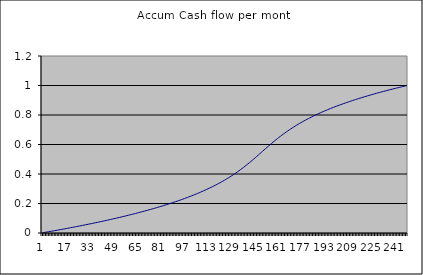
| Category | Accum Cash flow per month |
|---|---|
| 0 | 0.002 |
| 1 | 0.003 |
| 2 | 0.005 |
| 3 | 0.007 |
| 4 | 0.009 |
| 5 | 0.01 |
| 6 | 0.012 |
| 7 | 0.014 |
| 8 | 0.016 |
| 9 | 0.018 |
| 10 | 0.019 |
| 11 | 0.021 |
| 12 | 0.023 |
| 13 | 0.025 |
| 14 | 0.027 |
| 15 | 0.029 |
| 16 | 0.03 |
| 17 | 0.032 |
| 18 | 0.034 |
| 19 | 0.036 |
| 20 | 0.038 |
| 21 | 0.04 |
| 22 | 0.042 |
| 23 | 0.044 |
| 24 | 0.046 |
| 25 | 0.048 |
| 26 | 0.05 |
| 27 | 0.052 |
| 28 | 0.054 |
| 29 | 0.056 |
| 30 | 0.058 |
| 31 | 0.06 |
| 32 | 0.062 |
| 33 | 0.064 |
| 34 | 0.066 |
| 35 | 0.068 |
| 36 | 0.07 |
| 37 | 0.072 |
| 38 | 0.074 |
| 39 | 0.076 |
| 40 | 0.079 |
| 41 | 0.081 |
| 42 | 0.083 |
| 43 | 0.085 |
| 44 | 0.087 |
| 45 | 0.09 |
| 46 | 0.092 |
| 47 | 0.094 |
| 48 | 0.096 |
| 49 | 0.099 |
| 50 | 0.101 |
| 51 | 0.103 |
| 52 | 0.106 |
| 53 | 0.108 |
| 54 | 0.11 |
| 55 | 0.113 |
| 56 | 0.115 |
| 57 | 0.118 |
| 58 | 0.12 |
| 59 | 0.123 |
| 60 | 0.125 |
| 61 | 0.128 |
| 62 | 0.13 |
| 63 | 0.133 |
| 64 | 0.135 |
| 65 | 0.138 |
| 66 | 0.141 |
| 67 | 0.143 |
| 68 | 0.146 |
| 69 | 0.149 |
| 70 | 0.151 |
| 71 | 0.154 |
| 72 | 0.157 |
| 73 | 0.16 |
| 74 | 0.163 |
| 75 | 0.165 |
| 76 | 0.168 |
| 77 | 0.171 |
| 78 | 0.174 |
| 79 | 0.177 |
| 80 | 0.18 |
| 81 | 0.183 |
| 82 | 0.186 |
| 83 | 0.189 |
| 84 | 0.193 |
| 85 | 0.196 |
| 86 | 0.199 |
| 87 | 0.202 |
| 88 | 0.206 |
| 89 | 0.209 |
| 90 | 0.212 |
| 91 | 0.216 |
| 92 | 0.219 |
| 93 | 0.223 |
| 94 | 0.226 |
| 95 | 0.23 |
| 96 | 0.234 |
| 97 | 0.237 |
| 98 | 0.241 |
| 99 | 0.245 |
| 100 | 0.249 |
| 101 | 0.253 |
| 102 | 0.256 |
| 103 | 0.261 |
| 104 | 0.265 |
| 105 | 0.269 |
| 106 | 0.273 |
| 107 | 0.277 |
| 108 | 0.282 |
| 109 | 0.286 |
| 110 | 0.291 |
| 111 | 0.295 |
| 112 | 0.3 |
| 113 | 0.304 |
| 114 | 0.309 |
| 115 | 0.314 |
| 116 | 0.319 |
| 117 | 0.324 |
| 118 | 0.329 |
| 119 | 0.335 |
| 120 | 0.34 |
| 121 | 0.346 |
| 122 | 0.351 |
| 123 | 0.357 |
| 124 | 0.363 |
| 125 | 0.369 |
| 126 | 0.375 |
| 127 | 0.381 |
| 128 | 0.388 |
| 129 | 0.394 |
| 130 | 0.401 |
| 131 | 0.408 |
| 132 | 0.415 |
| 133 | 0.422 |
| 134 | 0.429 |
| 135 | 0.437 |
| 136 | 0.444 |
| 137 | 0.452 |
| 138 | 0.46 |
| 139 | 0.468 |
| 140 | 0.476 |
| 141 | 0.485 |
| 142 | 0.493 |
| 143 | 0.502 |
| 144 | 0.51 |
| 145 | 0.519 |
| 146 | 0.528 |
| 147 | 0.537 |
| 148 | 0.546 |
| 149 | 0.554 |
| 150 | 0.563 |
| 151 | 0.572 |
| 152 | 0.581 |
| 153 | 0.59 |
| 154 | 0.598 |
| 155 | 0.607 |
| 156 | 0.615 |
| 157 | 0.624 |
| 158 | 0.632 |
| 159 | 0.64 |
| 160 | 0.648 |
| 161 | 0.655 |
| 162 | 0.663 |
| 163 | 0.67 |
| 164 | 0.678 |
| 165 | 0.685 |
| 166 | 0.692 |
| 167 | 0.699 |
| 168 | 0.705 |
| 169 | 0.712 |
| 170 | 0.718 |
| 171 | 0.725 |
| 172 | 0.731 |
| 173 | 0.737 |
| 174 | 0.743 |
| 175 | 0.748 |
| 176 | 0.754 |
| 177 | 0.76 |
| 178 | 0.765 |
| 179 | 0.77 |
| 180 | 0.776 |
| 181 | 0.781 |
| 182 | 0.786 |
| 183 | 0.791 |
| 184 | 0.796 |
| 185 | 0.8 |
| 186 | 0.805 |
| 187 | 0.81 |
| 188 | 0.814 |
| 189 | 0.819 |
| 190 | 0.823 |
| 191 | 0.827 |
| 192 | 0.832 |
| 193 | 0.836 |
| 194 | 0.84 |
| 195 | 0.844 |
| 196 | 0.848 |
| 197 | 0.852 |
| 198 | 0.856 |
| 199 | 0.859 |
| 200 | 0.863 |
| 201 | 0.867 |
| 202 | 0.871 |
| 203 | 0.874 |
| 204 | 0.878 |
| 205 | 0.881 |
| 206 | 0.885 |
| 207 | 0.888 |
| 208 | 0.892 |
| 209 | 0.895 |
| 210 | 0.898 |
| 211 | 0.902 |
| 212 | 0.905 |
| 213 | 0.908 |
| 214 | 0.911 |
| 215 | 0.914 |
| 216 | 0.917 |
| 217 | 0.92 |
| 218 | 0.924 |
| 219 | 0.927 |
| 220 | 0.929 |
| 221 | 0.932 |
| 222 | 0.935 |
| 223 | 0.938 |
| 224 | 0.941 |
| 225 | 0.944 |
| 226 | 0.947 |
| 227 | 0.949 |
| 228 | 0.952 |
| 229 | 0.955 |
| 230 | 0.958 |
| 231 | 0.96 |
| 232 | 0.963 |
| 233 | 0.966 |
| 234 | 0.968 |
| 235 | 0.971 |
| 236 | 0.973 |
| 237 | 0.976 |
| 238 | 0.978 |
| 239 | 0.981 |
| 240 | 0.983 |
| 241 | 0.986 |
| 242 | 0.988 |
| 243 | 0.991 |
| 244 | 0.993 |
| 245 | 0.995 |
| 246 | 0.998 |
| 247 | 1 |